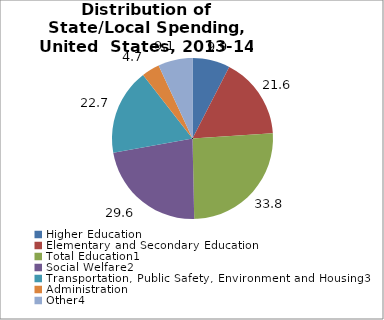
| Category | Series 0 |
|---|---|
| Higher Education | 9.924 |
| Elementary and Secondary Education | 21.625 |
| Total Education1 | 33.777 |
| Social Welfare2 | 29.64 |
| Transportation, Public Safety, Environment and Housing3 | 22.735 |
| Administration | 4.744 |
| Other4 | 9.103 |